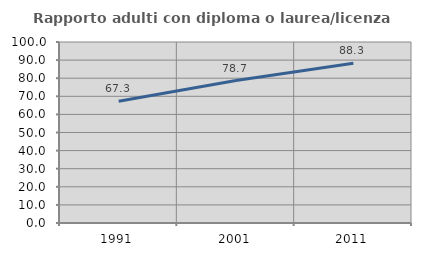
| Category | Rapporto adulti con diploma o laurea/licenza media  |
|---|---|
| 1991.0 | 67.284 |
| 2001.0 | 78.696 |
| 2011.0 | 88.281 |